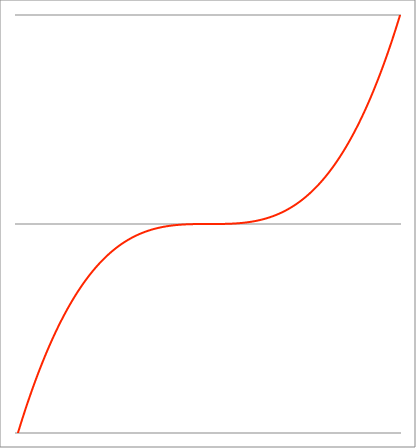
| Category | Series 1 |
|---|---|
| -1.01 | -1.03 |
| -1.00899 | -1.027 |
| -1.00798 | -1.024 |
| -1.00697 | -1.021 |
| -1.00596 | -1.018 |
| -1.00495 | -1.015 |
| -1.00394 | -1.012 |
| -1.00293 | -1.009 |
| -1.00192 | -1.006 |
| -1.00091 | -1.003 |
| -0.9999 | -1 |
| -0.99889 | -0.997 |
| -0.99788 | -0.994 |
| -0.996870000000001 | -0.991 |
| -0.995860000000001 | -0.988 |
| -0.994850000000001 | -0.985 |
| -0.993840000000001 | -0.982 |
| -0.992830000000001 | -0.979 |
| -0.991820000000001 | -0.976 |
| -0.990810000000001 | -0.973 |
| -0.989800000000001 | -0.97 |
| -0.988790000000001 | -0.967 |
| -0.987780000000001 | -0.964 |
| -0.986770000000001 | -0.961 |
| -0.985760000000001 | -0.958 |
| -0.984750000000001 | -0.955 |
| -0.983740000000001 | -0.952 |
| -0.982730000000001 | -0.949 |
| -0.981720000000001 | -0.946 |
| -0.980710000000001 | -0.943 |
| -0.979700000000001 | -0.94 |
| -0.978690000000001 | -0.937 |
| -0.977680000000001 | -0.935 |
| -0.976670000000001 | -0.932 |
| -0.975660000000001 | -0.929 |
| -0.974650000000002 | -0.926 |
| -0.973640000000002 | -0.923 |
| -0.972630000000002 | -0.92 |
| -0.971620000000002 | -0.917 |
| -0.970610000000002 | -0.914 |
| -0.969600000000002 | -0.912 |
| -0.968590000000002 | -0.909 |
| -0.967580000000002 | -0.906 |
| -0.966570000000002 | -0.903 |
| -0.965560000000002 | -0.9 |
| -0.964550000000002 | -0.897 |
| -0.963540000000002 | -0.895 |
| -0.962530000000002 | -0.892 |
| -0.961520000000002 | -0.889 |
| -0.960510000000002 | -0.886 |
| -0.959500000000002 | -0.883 |
| -0.958490000000002 | -0.881 |
| -0.957480000000002 | -0.878 |
| -0.956470000000002 | -0.875 |
| -0.955460000000002 | -0.872 |
| -0.954450000000002 | -0.869 |
| -0.953440000000002 | -0.867 |
| -0.952430000000003 | -0.864 |
| -0.951420000000003 | -0.861 |
| -0.950410000000003 | -0.858 |
| -0.949400000000003 | -0.856 |
| -0.948390000000003 | -0.853 |
| -0.947380000000003 | -0.85 |
| -0.946370000000003 | -0.848 |
| -0.945360000000003 | -0.845 |
| -0.944350000000003 | -0.842 |
| -0.943340000000003 | -0.839 |
| -0.942330000000003 | -0.837 |
| -0.941320000000003 | -0.834 |
| -0.940310000000003 | -0.831 |
| -0.939300000000003 | -0.829 |
| -0.938290000000003 | -0.826 |
| -0.937280000000003 | -0.823 |
| -0.936270000000003 | -0.821 |
| -0.935260000000003 | -0.818 |
| -0.934250000000003 | -0.815 |
| -0.933240000000003 | -0.813 |
| -0.932230000000003 | -0.81 |
| -0.931220000000003 | -0.808 |
| -0.930210000000004 | -0.805 |
| -0.929200000000004 | -0.802 |
| -0.928190000000004 | -0.8 |
| -0.927180000000004 | -0.797 |
| -0.926170000000004 | -0.794 |
| -0.925160000000004 | -0.792 |
| -0.924150000000004 | -0.789 |
| -0.923140000000004 | -0.787 |
| -0.922130000000004 | -0.784 |
| -0.921120000000004 | -0.782 |
| -0.920110000000004 | -0.779 |
| -0.919100000000004 | -0.776 |
| -0.918090000000004 | -0.774 |
| -0.917080000000004 | -0.771 |
| -0.916070000000004 | -0.769 |
| -0.915060000000004 | -0.766 |
| -0.914050000000004 | -0.764 |
| -0.913040000000004 | -0.761 |
| -0.912030000000004 | -0.759 |
| -0.911020000000004 | -0.756 |
| -0.910010000000004 | -0.754 |
| -0.909000000000004 | -0.751 |
| -0.907990000000004 | -0.749 |
| -0.906980000000005 | -0.746 |
| -0.905970000000005 | -0.744 |
| -0.904960000000005 | -0.741 |
| -0.903950000000005 | -0.739 |
| -0.902940000000005 | -0.736 |
| -0.901930000000005 | -0.734 |
| -0.900920000000005 | -0.731 |
| -0.899910000000005 | -0.729 |
| -0.898900000000005 | -0.726 |
| -0.897890000000005 | -0.724 |
| -0.896880000000005 | -0.721 |
| -0.895870000000005 | -0.719 |
| -0.894860000000005 | -0.717 |
| -0.893850000000005 | -0.714 |
| -0.892840000000005 | -0.712 |
| -0.891830000000005 | -0.709 |
| -0.890820000000005 | -0.707 |
| -0.889810000000005 | -0.705 |
| -0.888800000000005 | -0.702 |
| -0.887790000000005 | -0.7 |
| -0.886780000000005 | -0.697 |
| -0.885770000000005 | -0.695 |
| -0.884760000000005 | -0.693 |
| -0.883750000000006 | -0.69 |
| -0.882740000000006 | -0.688 |
| -0.881730000000006 | -0.685 |
| -0.880720000000006 | -0.683 |
| -0.879710000000006 | -0.681 |
| -0.878700000000006 | -0.678 |
| -0.877690000000006 | -0.676 |
| -0.876680000000006 | -0.674 |
| -0.875670000000006 | -0.671 |
| -0.874660000000006 | -0.669 |
| -0.873650000000006 | -0.667 |
| -0.872640000000006 | -0.665 |
| -0.871630000000006 | -0.662 |
| -0.870620000000006 | -0.66 |
| -0.869610000000006 | -0.658 |
| -0.868600000000006 | -0.655 |
| -0.867590000000006 | -0.653 |
| -0.866580000000006 | -0.651 |
| -0.865570000000006 | -0.648 |
| -0.864560000000006 | -0.646 |
| -0.863550000000006 | -0.644 |
| -0.862540000000006 | -0.642 |
| -0.861530000000007 | -0.639 |
| -0.860520000000007 | -0.637 |
| -0.859510000000007 | -0.635 |
| -0.858500000000007 | -0.633 |
| -0.857490000000007 | -0.631 |
| -0.856480000000007 | -0.628 |
| -0.855470000000007 | -0.626 |
| -0.854460000000007 | -0.624 |
| -0.853450000000007 | -0.622 |
| -0.852440000000007 | -0.619 |
| -0.851430000000007 | -0.617 |
| -0.850420000000007 | -0.615 |
| -0.849410000000007 | -0.613 |
| -0.848400000000007 | -0.611 |
| -0.847390000000007 | -0.608 |
| -0.846380000000007 | -0.606 |
| -0.845370000000007 | -0.604 |
| -0.844360000000007 | -0.602 |
| -0.843350000000007 | -0.6 |
| -0.842340000000007 | -0.598 |
| -0.841330000000007 | -0.596 |
| -0.840320000000007 | -0.593 |
| -0.839310000000007 | -0.591 |
| -0.838300000000008 | -0.589 |
| -0.837290000000008 | -0.587 |
| -0.836280000000008 | -0.585 |
| -0.835270000000008 | -0.583 |
| -0.834260000000008 | -0.581 |
| -0.833250000000008 | -0.579 |
| -0.832240000000008 | -0.576 |
| -0.831230000000008 | -0.574 |
| -0.830220000000008 | -0.572 |
| -0.829210000000008 | -0.57 |
| -0.828200000000008 | -0.568 |
| -0.827190000000008 | -0.566 |
| -0.826180000000008 | -0.564 |
| -0.825170000000008 | -0.562 |
| -0.824160000000008 | -0.56 |
| -0.823150000000008 | -0.558 |
| -0.822140000000008 | -0.556 |
| -0.821130000000008 | -0.554 |
| -0.820120000000008 | -0.552 |
| -0.819110000000008 | -0.55 |
| -0.818100000000008 | -0.548 |
| -0.817090000000008 | -0.546 |
| -0.816080000000009 | -0.543 |
| -0.815070000000009 | -0.541 |
| -0.814060000000009 | -0.539 |
| -0.813050000000009 | -0.537 |
| -0.812040000000009 | -0.535 |
| -0.811030000000009 | -0.533 |
| -0.810020000000009 | -0.531 |
| -0.809010000000009 | -0.529 |
| -0.808000000000009 | -0.528 |
| -0.806990000000009 | -0.526 |
| -0.805980000000009 | -0.524 |
| -0.804970000000009 | -0.522 |
| -0.803960000000009 | -0.52 |
| -0.802950000000009 | -0.518 |
| -0.801940000000009 | -0.516 |
| -0.800930000000009 | -0.514 |
| -0.799920000000009 | -0.512 |
| -0.798910000000009 | -0.51 |
| -0.797900000000009 | -0.508 |
| -0.796890000000009 | -0.506 |
| -0.795880000000009 | -0.504 |
| -0.794870000000009 | -0.502 |
| -0.793860000000009 | -0.5 |
| -0.79285000000001 | -0.498 |
| -0.79184000000001 | -0.496 |
| -0.79083000000001 | -0.495 |
| -0.78982000000001 | -0.493 |
| -0.78881000000001 | -0.491 |
| -0.78780000000001 | -0.489 |
| -0.78679000000001 | -0.487 |
| -0.78578000000001 | -0.485 |
| -0.78477000000001 | -0.483 |
| -0.78376000000001 | -0.481 |
| -0.78275000000001 | -0.48 |
| -0.78174000000001 | -0.478 |
| -0.78073000000001 | -0.476 |
| -0.77972000000001 | -0.474 |
| -0.77871000000001 | -0.472 |
| -0.77770000000001 | -0.47 |
| -0.77669000000001 | -0.469 |
| -0.77568000000001 | -0.467 |
| -0.77467000000001 | -0.465 |
| -0.77366000000001 | -0.463 |
| -0.77265000000001 | -0.461 |
| -0.77164000000001 | -0.459 |
| -0.770630000000011 | -0.458 |
| -0.769620000000011 | -0.456 |
| -0.768610000000011 | -0.454 |
| -0.767600000000011 | -0.452 |
| -0.766590000000011 | -0.45 |
| -0.765580000000011 | -0.449 |
| -0.764570000000011 | -0.447 |
| -0.763560000000011 | -0.445 |
| -0.762550000000011 | -0.443 |
| -0.761540000000011 | -0.442 |
| -0.760530000000011 | -0.44 |
| -0.759520000000011 | -0.438 |
| -0.758510000000011 | -0.436 |
| -0.757500000000011 | -0.435 |
| -0.756490000000011 | -0.433 |
| -0.755480000000011 | -0.431 |
| -0.754470000000011 | -0.429 |
| -0.753460000000011 | -0.428 |
| -0.752450000000011 | -0.426 |
| -0.751440000000011 | -0.424 |
| -0.750430000000011 | -0.423 |
| -0.749420000000011 | -0.421 |
| -0.748410000000011 | -0.419 |
| -0.747400000000012 | -0.418 |
| -0.746390000000012 | -0.416 |
| -0.745380000000012 | -0.414 |
| -0.744370000000012 | -0.412 |
| -0.743360000000012 | -0.411 |
| -0.742350000000012 | -0.409 |
| -0.741340000000012 | -0.407 |
| -0.740330000000012 | -0.406 |
| -0.739320000000012 | -0.404 |
| -0.738310000000012 | -0.402 |
| -0.737300000000012 | -0.401 |
| -0.736290000000012 | -0.399 |
| -0.735280000000012 | -0.398 |
| -0.734270000000012 | -0.396 |
| -0.733260000000012 | -0.394 |
| -0.732250000000012 | -0.393 |
| -0.731240000000012 | -0.391 |
| -0.730230000000012 | -0.389 |
| -0.729220000000012 | -0.388 |
| -0.728210000000012 | -0.386 |
| -0.727200000000012 | -0.385 |
| -0.726190000000012 | -0.383 |
| -0.725180000000013 | -0.381 |
| -0.724170000000013 | -0.38 |
| -0.723160000000013 | -0.378 |
| -0.722150000000013 | -0.377 |
| -0.721140000000013 | -0.375 |
| -0.720130000000013 | -0.373 |
| -0.719120000000013 | -0.372 |
| -0.718110000000013 | -0.37 |
| -0.717100000000013 | -0.369 |
| -0.716090000000013 | -0.367 |
| -0.715080000000013 | -0.366 |
| -0.714070000000013 | -0.364 |
| -0.713060000000013 | -0.363 |
| -0.712050000000013 | -0.361 |
| -0.711040000000013 | -0.359 |
| -0.710030000000013 | -0.358 |
| -0.709020000000013 | -0.356 |
| -0.708010000000013 | -0.355 |
| -0.707000000000013 | -0.353 |
| -0.705990000000013 | -0.352 |
| -0.704980000000013 | -0.35 |
| -0.703970000000013 | -0.349 |
| -0.702960000000014 | -0.347 |
| -0.701950000000014 | -0.346 |
| -0.700940000000014 | -0.344 |
| -0.699930000000014 | -0.343 |
| -0.698920000000014 | -0.341 |
| -0.697910000000014 | -0.34 |
| -0.696900000000014 | -0.338 |
| -0.695890000000014 | -0.337 |
| -0.694880000000014 | -0.336 |
| -0.693870000000014 | -0.334 |
| -0.692860000000014 | -0.333 |
| -0.691850000000014 | -0.331 |
| -0.690840000000014 | -0.33 |
| -0.689830000000014 | -0.328 |
| -0.688820000000014 | -0.327 |
| -0.687810000000014 | -0.325 |
| -0.686800000000014 | -0.324 |
| -0.685790000000014 | -0.323 |
| -0.684780000000014 | -0.321 |
| -0.683770000000014 | -0.32 |
| -0.682760000000014 | -0.318 |
| -0.681750000000014 | -0.317 |
| -0.680740000000014 | -0.315 |
| -0.679730000000015 | -0.314 |
| -0.678720000000015 | -0.313 |
| -0.677710000000015 | -0.311 |
| -0.676700000000015 | -0.31 |
| -0.675690000000015 | -0.308 |
| -0.674680000000015 | -0.307 |
| -0.673670000000015 | -0.306 |
| -0.672660000000015 | -0.304 |
| -0.671650000000015 | -0.303 |
| -0.670640000000015 | -0.302 |
| -0.669630000000015 | -0.3 |
| -0.668620000000015 | -0.299 |
| -0.667610000000015 | -0.298 |
| -0.666600000000015 | -0.296 |
| -0.665590000000015 | -0.295 |
| -0.664580000000015 | -0.294 |
| -0.663570000000015 | -0.292 |
| -0.662560000000015 | -0.291 |
| -0.661550000000015 | -0.29 |
| -0.660540000000015 | -0.288 |
| -0.659530000000015 | -0.287 |
| -0.658520000000015 | -0.286 |
| -0.657510000000015 | -0.284 |
| -0.656500000000016 | -0.283 |
| -0.655490000000016 | -0.282 |
| -0.654480000000016 | -0.28 |
| -0.653470000000016 | -0.279 |
| -0.652460000000016 | -0.278 |
| -0.651450000000016 | -0.276 |
| -0.650440000000016 | -0.275 |
| -0.649430000000016 | -0.274 |
| -0.648420000000016 | -0.273 |
| -0.647410000000016 | -0.271 |
| -0.646400000000016 | -0.27 |
| -0.645390000000016 | -0.269 |
| -0.644380000000016 | -0.268 |
| -0.643370000000016 | -0.266 |
| -0.642360000000016 | -0.265 |
| -0.641350000000016 | -0.264 |
| -0.640340000000016 | -0.263 |
| -0.639330000000016 | -0.261 |
| -0.638320000000016 | -0.26 |
| -0.637310000000016 | -0.259 |
| -0.636300000000016 | -0.258 |
| -0.635290000000016 | -0.256 |
| -0.634280000000017 | -0.255 |
| -0.633270000000017 | -0.254 |
| -0.632260000000017 | -0.253 |
| -0.631250000000017 | -0.252 |
| -0.630240000000017 | -0.25 |
| -0.629230000000017 | -0.249 |
| -0.628220000000017 | -0.248 |
| -0.627210000000017 | -0.247 |
| -0.626200000000017 | -0.246 |
| -0.625190000000017 | -0.244 |
| -0.624180000000017 | -0.243 |
| -0.623170000000017 | -0.242 |
| -0.622160000000017 | -0.241 |
| -0.621150000000017 | -0.24 |
| -0.620140000000017 | -0.238 |
| -0.619130000000017 | -0.237 |
| -0.618120000000017 | -0.236 |
| -0.617110000000017 | -0.235 |
| -0.616100000000017 | -0.234 |
| -0.615090000000017 | -0.233 |
| -0.614080000000017 | -0.232 |
| -0.613070000000017 | -0.23 |
| -0.612060000000017 | -0.229 |
| -0.611050000000018 | -0.228 |
| -0.610040000000018 | -0.227 |
| -0.609030000000018 | -0.226 |
| -0.608020000000018 | -0.225 |
| -0.607010000000018 | -0.224 |
| -0.606000000000018 | -0.223 |
| -0.604990000000018 | -0.221 |
| -0.603980000000018 | -0.22 |
| -0.602970000000018 | -0.219 |
| -0.601960000000018 | -0.218 |
| -0.600950000000018 | -0.217 |
| -0.599940000000018 | -0.216 |
| -0.598930000000018 | -0.215 |
| -0.597920000000018 | -0.214 |
| -0.596910000000018 | -0.213 |
| -0.595900000000018 | -0.212 |
| -0.594890000000018 | -0.211 |
| -0.593880000000018 | -0.209 |
| -0.592870000000018 | -0.208 |
| -0.591860000000018 | -0.207 |
| -0.590850000000019 | -0.206 |
| -0.589840000000019 | -0.205 |
| -0.588830000000019 | -0.204 |
| -0.587820000000019 | -0.203 |
| -0.586810000000019 | -0.202 |
| -0.585800000000019 | -0.201 |
| -0.584790000000019 | -0.2 |
| -0.583780000000019 | -0.199 |
| -0.582770000000019 | -0.198 |
| -0.581760000000019 | -0.197 |
| -0.580750000000019 | -0.196 |
| -0.579740000000019 | -0.195 |
| -0.578730000000019 | -0.194 |
| -0.577720000000019 | -0.193 |
| -0.576710000000019 | -0.192 |
| -0.575700000000019 | -0.191 |
| -0.574690000000019 | -0.19 |
| -0.573680000000019 | -0.189 |
| -0.572670000000019 | -0.188 |
| -0.571660000000019 | -0.187 |
| -0.570650000000019 | -0.186 |
| -0.569640000000019 | -0.185 |
| -0.568630000000019 | -0.184 |
| -0.56762000000002 | -0.183 |
| -0.56661000000002 | -0.182 |
| -0.56560000000002 | -0.181 |
| -0.56459000000002 | -0.18 |
| -0.56358000000002 | -0.179 |
| -0.56257000000002 | -0.178 |
| -0.56156000000002 | -0.177 |
| -0.56055000000002 | -0.176 |
| -0.55954000000002 | -0.175 |
| -0.55853000000002 | -0.174 |
| -0.55752000000002 | -0.173 |
| -0.55651000000002 | -0.172 |
| -0.55550000000002 | -0.171 |
| -0.55449000000002 | -0.17 |
| -0.55348000000002 | -0.17 |
| -0.55247000000002 | -0.169 |
| -0.55146000000002 | -0.168 |
| -0.55045000000002 | -0.167 |
| -0.54944000000002 | -0.166 |
| -0.54843000000002 | -0.165 |
| -0.54742000000002 | -0.164 |
| -0.54641000000002 | -0.163 |
| -0.545400000000021 | -0.162 |
| -0.544390000000021 | -0.161 |
| -0.543380000000021 | -0.16 |
| -0.542370000000021 | -0.16 |
| -0.541360000000021 | -0.159 |
| -0.540350000000021 | -0.158 |
| -0.539340000000021 | -0.157 |
| -0.538330000000021 | -0.156 |
| -0.537320000000021 | -0.155 |
| -0.536310000000021 | -0.154 |
| -0.535300000000021 | -0.153 |
| -0.534290000000021 | -0.153 |
| -0.533280000000021 | -0.152 |
| -0.532270000000021 | -0.151 |
| -0.531260000000021 | -0.15 |
| -0.530250000000021 | -0.149 |
| -0.529240000000021 | -0.148 |
| -0.528230000000021 | -0.147 |
| -0.527220000000021 | -0.147 |
| -0.526210000000021 | -0.146 |
| -0.525200000000021 | -0.145 |
| -0.524190000000021 | -0.144 |
| -0.523180000000022 | -0.143 |
| -0.522170000000022 | -0.142 |
| -0.521160000000022 | -0.142 |
| -0.520150000000022 | -0.141 |
| -0.519140000000022 | -0.14 |
| -0.518130000000022 | -0.139 |
| -0.517120000000022 | -0.138 |
| -0.516110000000022 | -0.137 |
| -0.515100000000022 | -0.137 |
| -0.514090000000022 | -0.136 |
| -0.513080000000022 | -0.135 |
| -0.512070000000022 | -0.134 |
| -0.511060000000022 | -0.133 |
| -0.510050000000022 | -0.133 |
| -0.509040000000022 | -0.132 |
| -0.508030000000022 | -0.131 |
| -0.507020000000022 | -0.13 |
| -0.506010000000022 | -0.13 |
| -0.505000000000022 | -0.129 |
| -0.503990000000022 | -0.128 |
| -0.502980000000022 | -0.127 |
| -0.501970000000022 | -0.126 |
| -0.500960000000022 | -0.126 |
| -0.499950000000022 | -0.125 |
| -0.498940000000022 | -0.124 |
| -0.497930000000022 | -0.123 |
| -0.496920000000022 | -0.123 |
| -0.495910000000022 | -0.122 |
| -0.494900000000022 | -0.121 |
| -0.493890000000022 | -0.12 |
| -0.492880000000022 | -0.12 |
| -0.491870000000022 | -0.119 |
| -0.490860000000022 | -0.118 |
| -0.489850000000022 | -0.118 |
| -0.488840000000022 | -0.117 |
| -0.487830000000022 | -0.116 |
| -0.486820000000022 | -0.115 |
| -0.485810000000022 | -0.115 |
| -0.484800000000022 | -0.114 |
| -0.483790000000022 | -0.113 |
| -0.482780000000022 | -0.113 |
| -0.481770000000022 | -0.112 |
| -0.480760000000022 | -0.111 |
| -0.479750000000022 | -0.11 |
| -0.478740000000022 | -0.11 |
| -0.477730000000022 | -0.109 |
| -0.476720000000022 | -0.108 |
| -0.475710000000022 | -0.108 |
| -0.474700000000022 | -0.107 |
| -0.473690000000022 | -0.106 |
| -0.472680000000022 | -0.106 |
| -0.471670000000022 | -0.105 |
| -0.470660000000022 | -0.104 |
| -0.469650000000022 | -0.104 |
| -0.468640000000022 | -0.103 |
| -0.467630000000022 | -0.102 |
| -0.466620000000022 | -0.102 |
| -0.465610000000022 | -0.101 |
| -0.464600000000022 | -0.1 |
| -0.463590000000022 | -0.1 |
| -0.462580000000022 | -0.099 |
| -0.461570000000022 | -0.098 |
| -0.460560000000022 | -0.098 |
| -0.459550000000022 | -0.097 |
| -0.458540000000022 | -0.096 |
| -0.457530000000022 | -0.096 |
| -0.456520000000022 | -0.095 |
| -0.455510000000022 | -0.095 |
| -0.454500000000022 | -0.094 |
| -0.453490000000022 | -0.093 |
| -0.452480000000022 | -0.093 |
| -0.451470000000022 | -0.092 |
| -0.450460000000022 | -0.091 |
| -0.449450000000022 | -0.091 |
| -0.448440000000022 | -0.09 |
| -0.447430000000022 | -0.09 |
| -0.446420000000022 | -0.089 |
| -0.445410000000022 | -0.088 |
| -0.444400000000022 | -0.088 |
| -0.443390000000022 | -0.087 |
| -0.442380000000022 | -0.087 |
| -0.441370000000022 | -0.086 |
| -0.440360000000022 | -0.085 |
| -0.439350000000022 | -0.085 |
| -0.438340000000022 | -0.084 |
| -0.437330000000022 | -0.084 |
| -0.436320000000022 | -0.083 |
| -0.435310000000022 | -0.082 |
| -0.434300000000022 | -0.082 |
| -0.433290000000022 | -0.081 |
| -0.432280000000022 | -0.081 |
| -0.431270000000022 | -0.08 |
| -0.430260000000022 | -0.08 |
| -0.429250000000022 | -0.079 |
| -0.428240000000022 | -0.079 |
| -0.427230000000022 | -0.078 |
| -0.426220000000022 | -0.077 |
| -0.425210000000022 | -0.077 |
| -0.424200000000022 | -0.076 |
| -0.423190000000022 | -0.076 |
| -0.422180000000022 | -0.075 |
| -0.421170000000022 | -0.075 |
| -0.420160000000022 | -0.074 |
| -0.419150000000022 | -0.074 |
| -0.418140000000022 | -0.073 |
| -0.417130000000022 | -0.073 |
| -0.416120000000022 | -0.072 |
| -0.415110000000022 | -0.072 |
| -0.414100000000022 | -0.071 |
| -0.413090000000022 | -0.07 |
| -0.412080000000022 | -0.07 |
| -0.411070000000022 | -0.069 |
| -0.410060000000021 | -0.069 |
| -0.409050000000021 | -0.068 |
| -0.408040000000021 | -0.068 |
| -0.407030000000021 | -0.067 |
| -0.406020000000021 | -0.067 |
| -0.405010000000021 | -0.066 |
| -0.404000000000021 | -0.066 |
| -0.402990000000021 | -0.065 |
| -0.401980000000021 | -0.065 |
| -0.400970000000021 | -0.064 |
| -0.399960000000021 | -0.064 |
| -0.398950000000021 | -0.063 |
| -0.397940000000021 | -0.063 |
| -0.396930000000021 | -0.063 |
| -0.395920000000021 | -0.062 |
| -0.394910000000021 | -0.062 |
| -0.393900000000021 | -0.061 |
| -0.392890000000021 | -0.061 |
| -0.391880000000021 | -0.06 |
| -0.390870000000021 | -0.06 |
| -0.389860000000021 | -0.059 |
| -0.388850000000021 | -0.059 |
| -0.387840000000021 | -0.058 |
| -0.386830000000021 | -0.058 |
| -0.385820000000021 | -0.057 |
| -0.384810000000021 | -0.057 |
| -0.383800000000021 | -0.057 |
| -0.382790000000021 | -0.056 |
| -0.381780000000021 | -0.056 |
| -0.380770000000021 | -0.055 |
| -0.379760000000021 | -0.055 |
| -0.378750000000021 | -0.054 |
| -0.377740000000021 | -0.054 |
| -0.376730000000021 | -0.053 |
| -0.375720000000021 | -0.053 |
| -0.374710000000021 | -0.053 |
| -0.373700000000021 | -0.052 |
| -0.372690000000021 | -0.052 |
| -0.371680000000021 | -0.051 |
| -0.370670000000021 | -0.051 |
| -0.369660000000021 | -0.051 |
| -0.368650000000021 | -0.05 |
| -0.367640000000021 | -0.05 |
| -0.366630000000021 | -0.049 |
| -0.365620000000021 | -0.049 |
| -0.364610000000021 | -0.048 |
| -0.363600000000021 | -0.048 |
| -0.362590000000021 | -0.048 |
| -0.361580000000021 | -0.047 |
| -0.360570000000021 | -0.047 |
| -0.359560000000021 | -0.046 |
| -0.358550000000021 | -0.046 |
| -0.357540000000021 | -0.046 |
| -0.356530000000021 | -0.045 |
| -0.355520000000021 | -0.045 |
| -0.354510000000021 | -0.045 |
| -0.353500000000021 | -0.044 |
| -0.352490000000021 | -0.044 |
| -0.351480000000021 | -0.043 |
| -0.350470000000021 | -0.043 |
| -0.349460000000021 | -0.043 |
| -0.348450000000021 | -0.042 |
| -0.347440000000021 | -0.042 |
| -0.346430000000021 | -0.042 |
| -0.345420000000021 | -0.041 |
| -0.344410000000021 | -0.041 |
| -0.343400000000021 | -0.04 |
| -0.342390000000021 | -0.04 |
| -0.341380000000021 | -0.04 |
| -0.340370000000021 | -0.039 |
| -0.339360000000021 | -0.039 |
| -0.338350000000021 | -0.039 |
| -0.337340000000021 | -0.038 |
| -0.336330000000021 | -0.038 |
| -0.335320000000021 | -0.038 |
| -0.334310000000021 | -0.037 |
| -0.333300000000021 | -0.037 |
| -0.332290000000021 | -0.037 |
| -0.331280000000021 | -0.036 |
| -0.330270000000021 | -0.036 |
| -0.329260000000021 | -0.036 |
| -0.328250000000021 | -0.035 |
| -0.327240000000021 | -0.035 |
| -0.326230000000021 | -0.035 |
| -0.325220000000021 | -0.034 |
| -0.324210000000021 | -0.034 |
| -0.323200000000021 | -0.034 |
| -0.322190000000021 | -0.033 |
| -0.321180000000021 | -0.033 |
| -0.320170000000021 | -0.033 |
| -0.31916000000002 | -0.033 |
| -0.31815000000002 | -0.032 |
| -0.31714000000002 | -0.032 |
| -0.31613000000002 | -0.032 |
| -0.31512000000002 | -0.031 |
| -0.31411000000002 | -0.031 |
| -0.31310000000002 | -0.031 |
| -0.31209000000002 | -0.03 |
| -0.31108000000002 | -0.03 |
| -0.31007000000002 | -0.03 |
| -0.30906000000002 | -0.03 |
| -0.30805000000002 | -0.029 |
| -0.30704000000002 | -0.029 |
| -0.30603000000002 | -0.029 |
| -0.30502000000002 | -0.028 |
| -0.30401000000002 | -0.028 |
| -0.30300000000002 | -0.028 |
| -0.30199000000002 | -0.028 |
| -0.30098000000002 | -0.027 |
| -0.29997000000002 | -0.027 |
| -0.29896000000002 | -0.027 |
| -0.29795000000002 | -0.026 |
| -0.29694000000002 | -0.026 |
| -0.29593000000002 | -0.026 |
| -0.29492000000002 | -0.026 |
| -0.29391000000002 | -0.025 |
| -0.29290000000002 | -0.025 |
| -0.29189000000002 | -0.025 |
| -0.29088000000002 | -0.025 |
| -0.28987000000002 | -0.024 |
| -0.28886000000002 | -0.024 |
| -0.28785000000002 | -0.024 |
| -0.28684000000002 | -0.024 |
| -0.28583000000002 | -0.023 |
| -0.28482000000002 | -0.023 |
| -0.28381000000002 | -0.023 |
| -0.28280000000002 | -0.023 |
| -0.28179000000002 | -0.022 |
| -0.28078000000002 | -0.022 |
| -0.27977000000002 | -0.022 |
| -0.27876000000002 | -0.022 |
| -0.27775000000002 | -0.021 |
| -0.27674000000002 | -0.021 |
| -0.27573000000002 | -0.021 |
| -0.27472000000002 | -0.021 |
| -0.27371000000002 | -0.021 |
| -0.27270000000002 | -0.02 |
| -0.27169000000002 | -0.02 |
| -0.27068000000002 | -0.02 |
| -0.26967000000002 | -0.02 |
| -0.26866000000002 | -0.019 |
| -0.26765000000002 | -0.019 |
| -0.26664000000002 | -0.019 |
| -0.26563000000002 | -0.019 |
| -0.26462000000002 | -0.019 |
| -0.26361000000002 | -0.018 |
| -0.26260000000002 | -0.018 |
| -0.26159000000002 | -0.018 |
| -0.26058000000002 | -0.018 |
| -0.25957000000002 | -0.017 |
| -0.25856000000002 | -0.017 |
| -0.25755000000002 | -0.017 |
| -0.25654000000002 | -0.017 |
| -0.25553000000002 | -0.017 |
| -0.25452000000002 | -0.016 |
| -0.25351000000002 | -0.016 |
| -0.25250000000002 | -0.016 |
| -0.25149000000002 | -0.016 |
| -0.25048000000002 | -0.016 |
| -0.24947000000002 | -0.016 |
| -0.24846000000002 | -0.015 |
| -0.24745000000002 | -0.015 |
| -0.24644000000002 | -0.015 |
| -0.24543000000002 | -0.015 |
| -0.24442000000002 | -0.015 |
| -0.24341000000002 | -0.014 |
| -0.24240000000002 | -0.014 |
| -0.24139000000002 | -0.014 |
| -0.24038000000002 | -0.014 |
| -0.23937000000002 | -0.014 |
| -0.23836000000002 | -0.014 |
| -0.23735000000002 | -0.013 |
| -0.23634000000002 | -0.013 |
| -0.23533000000002 | -0.013 |
| -0.23432000000002 | -0.013 |
| -0.23331000000002 | -0.013 |
| -0.23230000000002 | -0.013 |
| -0.23129000000002 | -0.012 |
| -0.23028000000002 | -0.012 |
| -0.22927000000002 | -0.012 |
| -0.22826000000002 | -0.012 |
| -0.22725000000002 | -0.012 |
| -0.22624000000002 | -0.012 |
| -0.22523000000002 | -0.011 |
| -0.224220000000019 | -0.011 |
| -0.223210000000019 | -0.011 |
| -0.222200000000019 | -0.011 |
| -0.221190000000019 | -0.011 |
| -0.220180000000019 | -0.011 |
| -0.219170000000019 | -0.011 |
| -0.218160000000019 | -0.01 |
| -0.217150000000019 | -0.01 |
| -0.216140000000019 | -0.01 |
| -0.215130000000019 | -0.01 |
| -0.214120000000019 | -0.01 |
| -0.213110000000019 | -0.01 |
| -0.212100000000019 | -0.01 |
| -0.211090000000019 | -0.009 |
| -0.210080000000019 | -0.009 |
| -0.209070000000019 | -0.009 |
| -0.208060000000019 | -0.009 |
| -0.207050000000019 | -0.009 |
| -0.206040000000019 | -0.009 |
| -0.205030000000019 | -0.009 |
| -0.204020000000019 | -0.008 |
| -0.203010000000019 | -0.008 |
| -0.202000000000019 | -0.008 |
| -0.200990000000019 | -0.008 |
| -0.199980000000019 | -0.008 |
| -0.198970000000019 | -0.008 |
| -0.197960000000019 | -0.008 |
| -0.196950000000019 | -0.008 |
| -0.195940000000019 | -0.008 |
| -0.194930000000019 | -0.007 |
| -0.193920000000019 | -0.007 |
| -0.192910000000019 | -0.007 |
| -0.191900000000019 | -0.007 |
| -0.190890000000019 | -0.007 |
| -0.189880000000019 | -0.007 |
| -0.188870000000019 | -0.007 |
| -0.187860000000019 | -0.007 |
| -0.186850000000019 | -0.007 |
| -0.185840000000019 | -0.006 |
| -0.184830000000019 | -0.006 |
| -0.183820000000019 | -0.006 |
| -0.182810000000019 | -0.006 |
| -0.181800000000019 | -0.006 |
| -0.180790000000019 | -0.006 |
| -0.179780000000019 | -0.006 |
| -0.178770000000019 | -0.006 |
| -0.177760000000019 | -0.006 |
| -0.176750000000019 | -0.006 |
| -0.175740000000019 | -0.005 |
| -0.174730000000019 | -0.005 |
| -0.173720000000019 | -0.005 |
| -0.172710000000019 | -0.005 |
| -0.171700000000019 | -0.005 |
| -0.170690000000019 | -0.005 |
| -0.169680000000019 | -0.005 |
| -0.168670000000019 | -0.005 |
| -0.167660000000019 | -0.005 |
| -0.166650000000019 | -0.005 |
| -0.165640000000019 | -0.005 |
| -0.164630000000019 | -0.004 |
| -0.163620000000019 | -0.004 |
| -0.162610000000019 | -0.004 |
| -0.161600000000019 | -0.004 |
| -0.160590000000019 | -0.004 |
| -0.159580000000019 | -0.004 |
| -0.158570000000019 | -0.004 |
| -0.157560000000019 | -0.004 |
| -0.156550000000019 | -0.004 |
| -0.155540000000019 | -0.004 |
| -0.154530000000019 | -0.004 |
| -0.153520000000019 | -0.004 |
| -0.152510000000019 | -0.004 |
| -0.151500000000019 | -0.003 |
| -0.150490000000019 | -0.003 |
| -0.149480000000019 | -0.003 |
| -0.148470000000019 | -0.003 |
| -0.147460000000019 | -0.003 |
| -0.146450000000019 | -0.003 |
| -0.145440000000019 | -0.003 |
| -0.144430000000019 | -0.003 |
| -0.143420000000019 | -0.003 |
| -0.142410000000019 | -0.003 |
| -0.141400000000019 | -0.003 |
| -0.140390000000019 | -0.003 |
| -0.139380000000019 | -0.003 |
| -0.138370000000019 | -0.003 |
| -0.137360000000019 | -0.003 |
| -0.136350000000019 | -0.003 |
| -0.135340000000019 | -0.002 |
| -0.134330000000019 | -0.002 |
| -0.133320000000019 | -0.002 |
| -0.132310000000019 | -0.002 |
| -0.131300000000019 | -0.002 |
| -0.130290000000018 | -0.002 |
| -0.129280000000018 | -0.002 |
| -0.128270000000018 | -0.002 |
| -0.127260000000018 | -0.002 |
| -0.126250000000018 | -0.002 |
| -0.125240000000018 | -0.002 |
| -0.124230000000018 | -0.002 |
| -0.123220000000018 | -0.002 |
| -0.122210000000018 | -0.002 |
| -0.121200000000018 | -0.002 |
| -0.120190000000018 | -0.002 |
| -0.119180000000018 | -0.002 |
| -0.118170000000018 | -0.002 |
| -0.117160000000018 | -0.002 |
| -0.116150000000018 | -0.002 |
| -0.115140000000018 | -0.002 |
| -0.114130000000018 | -0.001 |
| -0.113120000000018 | -0.001 |
| -0.112110000000018 | -0.001 |
| -0.111100000000018 | -0.001 |
| -0.110090000000018 | -0.001 |
| -0.109080000000018 | -0.001 |
| -0.108070000000018 | -0.001 |
| -0.107060000000018 | -0.001 |
| -0.106050000000018 | -0.001 |
| -0.105040000000019 | -0.001 |
| -0.104030000000019 | -0.001 |
| -0.103020000000019 | -0.001 |
| -0.102010000000019 | -0.001 |
| -0.101000000000019 | -0.001 |
| -0.0999900000000185 | -0.001 |
| -0.0989800000000185 | -0.001 |
| -0.0979700000000185 | -0.001 |
| -0.0969600000000185 | -0.001 |
| -0.0959500000000185 | -0.001 |
| -0.0949400000000185 | -0.001 |
| -0.0939300000000185 | -0.001 |
| -0.0929200000000185 | -0.001 |
| -0.0919100000000185 | -0.001 |
| -0.0909000000000185 | -0.001 |
| -0.0898900000000185 | -0.001 |
| -0.0888800000000185 | -0.001 |
| -0.0878700000000185 | -0.001 |
| -0.0868600000000185 | -0.001 |
| -0.0858500000000185 | -0.001 |
| -0.0848400000000186 | -0.001 |
| -0.0838300000000186 | -0.001 |
| -0.0828200000000186 | -0.001 |
| -0.0818100000000186 | -0.001 |
| -0.0808000000000186 | -0.001 |
| -0.0797900000000186 | -0.001 |
| -0.0787800000000186 | 0 |
| -0.0777700000000186 | 0 |
| -0.0767600000000186 | 0 |
| -0.0757500000000186 | 0 |
| -0.0747400000000186 | 0 |
| -0.0737300000000186 | 0 |
| -0.0727200000000186 | 0 |
| -0.0717100000000186 | 0 |
| -0.0707000000000186 | 0 |
| -0.0696900000000186 | 0 |
| -0.0686800000000186 | 0 |
| -0.0676700000000186 | 0 |
| -0.0666600000000186 | 0 |
| -0.0656500000000186 | 0 |
| -0.0646400000000186 | 0 |
| -0.0636300000000186 | 0 |
| -0.0626200000000186 | 0 |
| -0.0616100000000186 | 0 |
| -0.0606000000000186 | 0 |
| -0.0595900000000186 | 0 |
| -0.0585800000000186 | 0 |
| -0.0575700000000186 | 0 |
| -0.0565600000000186 | 0 |
| -0.0555500000000186 | 0 |
| -0.0545400000000186 | 0 |
| -0.0535300000000186 | 0 |
| -0.0525200000000187 | 0 |
| -0.0515100000000187 | 0 |
| -0.0505000000000187 | 0 |
| -0.0494900000000187 | 0 |
| -0.0484800000000187 | 0 |
| -0.0474700000000187 | 0 |
| -0.0464600000000187 | 0 |
| -0.0454500000000187 | 0 |
| -0.0444400000000187 | 0 |
| -0.0434300000000187 | 0 |
| -0.0424200000000187 | 0 |
| -0.0414100000000187 | 0 |
| -0.0404000000000187 | 0 |
| -0.0393900000000187 | 0 |
| -0.0383800000000187 | 0 |
| -0.0373700000000187 | 0 |
| -0.0363600000000187 | 0 |
| -0.0353500000000187 | 0 |
| -0.0343400000000187 | 0 |
| -0.0333300000000187 | 0 |
| -0.0323200000000187 | 0 |
| -0.0313100000000187 | 0 |
| -0.0303000000000187 | 0 |
| -0.0292900000000187 | 0 |
| -0.0282800000000187 | 0 |
| -0.0272700000000187 | 0 |
| -0.0262600000000187 | 0 |
| -0.0252500000000187 | 0 |
| -0.0242400000000187 | 0 |
| -0.0232300000000187 | 0 |
| -0.0222200000000187 | 0 |
| -0.0212100000000187 | 0 |
| -0.0202000000000187 | 0 |
| -0.0191900000000187 | 0 |
| -0.0181800000000187 | 0 |
| -0.0171700000000187 | 0 |
| -0.0161600000000187 | 0 |
| -0.0151500000000187 | 0 |
| -0.0141400000000187 | 0 |
| -0.0131300000000187 | 0 |
| -0.0121200000000187 | 0 |
| -0.0111100000000187 | 0 |
| -0.0101000000000187 | 0 |
| -0.00909000000001871 | 0 |
| -0.00808000000001871 | 0 |
| -0.00707000000001871 | 0 |
| -0.00606000000001871 | 0 |
| -0.00505000000001871 | 0 |
| -0.00404000000001871 | 0 |
| -0.00303000000001871 | 0 |
| -0.00202000000001871 | 0 |
| -0.00101000000001871 | 0 |
| -1.87124621353618e-14 | 0 |
| 0.00100999999998129 | 0 |
| 0.00201999999998129 | 0 |
| 0.00302999999998129 | 0 |
| 0.00403999999998129 | 0 |
| 0.00504999999998129 | 0 |
| 0.00605999999998129 | 0 |
| 0.00706999999998129 | 0 |
| 0.00807999999998129 | 0 |
| 0.00908999999998129 | 0 |
| 0.0100999999999813 | 0 |
| 0.0111099999999813 | 0 |
| 0.0121199999999813 | 0 |
| 0.0131299999999813 | 0 |
| 0.0141399999999813 | 0 |
| 0.0151499999999813 | 0 |
| 0.0161599999999813 | 0 |
| 0.0171699999999813 | 0 |
| 0.0181799999999813 | 0 |
| 0.0191899999999813 | 0 |
| 0.0201999999999813 | 0 |
| 0.0212099999999813 | 0 |
| 0.0222199999999813 | 0 |
| 0.0232299999999813 | 0 |
| 0.0242399999999813 | 0 |
| 0.0252499999999813 | 0 |
| 0.0262599999999813 | 0 |
| 0.0272699999999813 | 0 |
| 0.0282799999999813 | 0 |
| 0.0292899999999813 | 0 |
| 0.0302999999999813 | 0 |
| 0.0313099999999813 | 0 |
| 0.0323199999999813 | 0 |
| 0.0333299999999813 | 0 |
| 0.0343399999999813 | 0 |
| 0.0353499999999813 | 0 |
| 0.0363599999999813 | 0 |
| 0.0373699999999813 | 0 |
| 0.0383799999999813 | 0 |
| 0.0393899999999813 | 0 |
| 0.0403999999999813 | 0 |
| 0.0414099999999813 | 0 |
| 0.0424199999999813 | 0 |
| 0.0434299999999813 | 0 |
| 0.0444399999999812 | 0 |
| 0.0454499999999812 | 0 |
| 0.0464599999999812 | 0 |
| 0.0474699999999812 | 0 |
| 0.0484799999999812 | 0 |
| 0.0494899999999812 | 0 |
| 0.0504999999999812 | 0 |
| 0.0515099999999812 | 0 |
| 0.0525199999999812 | 0 |
| 0.0535299999999812 | 0 |
| 0.0545399999999812 | 0 |
| 0.0555499999999812 | 0 |
| 0.0565599999999812 | 0 |
| 0.0575699999999812 | 0 |
| 0.0585799999999812 | 0 |
| 0.0595899999999812 | 0 |
| 0.0605999999999812 | 0 |
| 0.0616099999999812 | 0 |
| 0.0626199999999812 | 0 |
| 0.0636299999999812 | 0 |
| 0.0646399999999812 | 0 |
| 0.0656499999999812 | 0 |
| 0.0666599999999812 | 0 |
| 0.0676699999999812 | 0 |
| 0.0686799999999812 | 0 |
| 0.0696899999999812 | 0 |
| 0.0706999999999812 | 0 |
| 0.0717099999999812 | 0 |
| 0.0727199999999812 | 0 |
| 0.0737299999999812 | 0 |
| 0.0747399999999812 | 0 |
| 0.0757499999999812 | 0 |
| 0.0767599999999812 | 0 |
| 0.0777699999999812 | 0 |
| 0.0787799999999811 | 0 |
| 0.0797899999999811 | 0.001 |
| 0.0807999999999811 | 0.001 |
| 0.0818099999999811 | 0.001 |
| 0.0828199999999811 | 0.001 |
| 0.0838299999999811 | 0.001 |
| 0.0848399999999811 | 0.001 |
| 0.0858499999999811 | 0.001 |
| 0.0868599999999811 | 0.001 |
| 0.0878699999999811 | 0.001 |
| 0.0888799999999811 | 0.001 |
| 0.0898899999999811 | 0.001 |
| 0.0908999999999811 | 0.001 |
| 0.0919099999999811 | 0.001 |
| 0.0929199999999811 | 0.001 |
| 0.0939299999999811 | 0.001 |
| 0.0949399999999811 | 0.001 |
| 0.0959499999999811 | 0.001 |
| 0.0969599999999811 | 0.001 |
| 0.0979699999999811 | 0.001 |
| 0.0989799999999811 | 0.001 |
| 0.0999899999999811 | 0.001 |
| 0.100999999999981 | 0.001 |
| 0.102009999999981 | 0.001 |
| 0.103019999999981 | 0.001 |
| 0.104029999999981 | 0.001 |
| 0.105039999999981 | 0.001 |
| 0.106049999999981 | 0.001 |
| 0.107059999999981 | 0.001 |
| 0.108069999999981 | 0.001 |
| 0.109079999999981 | 0.001 |
| 0.110089999999981 | 0.001 |
| 0.111099999999981 | 0.001 |
| 0.112109999999981 | 0.001 |
| 0.113119999999981 | 0.001 |
| 0.114129999999981 | 0.001 |
| 0.115139999999981 | 0.002 |
| 0.116149999999981 | 0.002 |
| 0.117159999999981 | 0.002 |
| 0.118169999999981 | 0.002 |
| 0.119179999999981 | 0.002 |
| 0.120189999999981 | 0.002 |
| 0.121199999999981 | 0.002 |
| 0.122209999999981 | 0.002 |
| 0.123219999999981 | 0.002 |
| 0.124229999999981 | 0.002 |
| 0.125239999999981 | 0.002 |
| 0.126249999999981 | 0.002 |
| 0.127259999999981 | 0.002 |
| 0.128269999999981 | 0.002 |
| 0.129279999999981 | 0.002 |
| 0.130289999999981 | 0.002 |
| 0.131299999999981 | 0.002 |
| 0.132309999999981 | 0.002 |
| 0.133319999999981 | 0.002 |
| 0.134329999999981 | 0.002 |
| 0.135339999999981 | 0.002 |
| 0.136349999999981 | 0.003 |
| 0.137359999999981 | 0.003 |
| 0.138369999999981 | 0.003 |
| 0.139379999999981 | 0.003 |
| 0.140389999999981 | 0.003 |
| 0.141399999999981 | 0.003 |
| 0.142409999999981 | 0.003 |
| 0.143419999999981 | 0.003 |
| 0.144429999999981 | 0.003 |
| 0.145439999999981 | 0.003 |
| 0.146449999999981 | 0.003 |
| 0.147459999999981 | 0.003 |
| 0.148469999999981 | 0.003 |
| 0.149479999999981 | 0.003 |
| 0.150489999999981 | 0.003 |
| 0.151499999999981 | 0.003 |
| 0.152509999999981 | 0.004 |
| 0.153519999999981 | 0.004 |
| 0.154529999999981 | 0.004 |
| 0.155539999999981 | 0.004 |
| 0.156549999999981 | 0.004 |
| 0.157559999999981 | 0.004 |
| 0.158569999999981 | 0.004 |
| 0.159579999999981 | 0.004 |
| 0.160589999999981 | 0.004 |
| 0.161599999999981 | 0.004 |
| 0.162609999999981 | 0.004 |
| 0.163619999999981 | 0.004 |
| 0.164629999999981 | 0.004 |
| 0.165639999999981 | 0.005 |
| 0.166649999999981 | 0.005 |
| 0.167659999999981 | 0.005 |
| 0.168669999999981 | 0.005 |
| 0.169679999999981 | 0.005 |
| 0.170689999999982 | 0.005 |
| 0.171699999999982 | 0.005 |
| 0.172709999999982 | 0.005 |
| 0.173719999999982 | 0.005 |
| 0.174729999999982 | 0.005 |
| 0.175739999999982 | 0.005 |
| 0.176749999999982 | 0.006 |
| 0.177759999999982 | 0.006 |
| 0.178769999999982 | 0.006 |
| 0.179779999999982 | 0.006 |
| 0.180789999999982 | 0.006 |
| 0.181799999999982 | 0.006 |
| 0.182809999999982 | 0.006 |
| 0.183819999999982 | 0.006 |
| 0.184829999999982 | 0.006 |
| 0.185839999999982 | 0.006 |
| 0.186849999999982 | 0.007 |
| 0.187859999999982 | 0.007 |
| 0.188869999999982 | 0.007 |
| 0.189879999999982 | 0.007 |
| 0.190889999999982 | 0.007 |
| 0.191899999999982 | 0.007 |
| 0.192909999999982 | 0.007 |
| 0.193919999999982 | 0.007 |
| 0.194929999999982 | 0.007 |
| 0.195939999999982 | 0.008 |
| 0.196949999999982 | 0.008 |
| 0.197959999999982 | 0.008 |
| 0.198969999999982 | 0.008 |
| 0.199979999999982 | 0.008 |
| 0.200989999999982 | 0.008 |
| 0.201999999999982 | 0.008 |
| 0.203009999999982 | 0.008 |
| 0.204019999999982 | 0.008 |
| 0.205029999999982 | 0.009 |
| 0.206039999999982 | 0.009 |
| 0.207049999999982 | 0.009 |
| 0.208059999999982 | 0.009 |
| 0.209069999999982 | 0.009 |
| 0.210079999999982 | 0.009 |
| 0.211089999999982 | 0.009 |
| 0.212099999999982 | 0.01 |
| 0.213109999999982 | 0.01 |
| 0.214119999999982 | 0.01 |
| 0.215129999999982 | 0.01 |
| 0.216139999999982 | 0.01 |
| 0.217149999999982 | 0.01 |
| 0.218159999999982 | 0.01 |
| 0.219169999999982 | 0.011 |
| 0.220179999999982 | 0.011 |
| 0.221189999999982 | 0.011 |
| 0.222199999999982 | 0.011 |
| 0.223209999999982 | 0.011 |
| 0.224219999999982 | 0.011 |
| 0.225229999999982 | 0.011 |
| 0.226239999999982 | 0.012 |
| 0.227249999999982 | 0.012 |
| 0.228259999999982 | 0.012 |
| 0.229269999999982 | 0.012 |
| 0.230279999999982 | 0.012 |
| 0.231289999999982 | 0.012 |
| 0.232299999999982 | 0.013 |
| 0.233309999999982 | 0.013 |
| 0.234319999999982 | 0.013 |
| 0.235329999999982 | 0.013 |
| 0.236339999999982 | 0.013 |
| 0.237349999999982 | 0.013 |
| 0.238359999999982 | 0.014 |
| 0.239369999999982 | 0.014 |
| 0.240379999999982 | 0.014 |
| 0.241389999999982 | 0.014 |
| 0.242399999999982 | 0.014 |
| 0.243409999999982 | 0.014 |
| 0.244419999999982 | 0.015 |
| 0.245429999999982 | 0.015 |
| 0.246439999999982 | 0.015 |
| 0.247449999999982 | 0.015 |
| 0.248459999999982 | 0.015 |
| 0.249469999999982 | 0.016 |
| 0.250479999999982 | 0.016 |
| 0.251489999999982 | 0.016 |
| 0.252499999999982 | 0.016 |
| 0.253509999999982 | 0.016 |
| 0.254519999999982 | 0.016 |
| 0.255529999999982 | 0.017 |
| 0.256539999999982 | 0.017 |
| 0.257549999999982 | 0.017 |
| 0.258559999999982 | 0.017 |
| 0.259569999999982 | 0.017 |
| 0.260579999999982 | 0.018 |
| 0.261589999999982 | 0.018 |
| 0.262599999999982 | 0.018 |
| 0.263609999999983 | 0.018 |
| 0.264619999999983 | 0.019 |
| 0.265629999999983 | 0.019 |
| 0.266639999999983 | 0.019 |
| 0.267649999999983 | 0.019 |
| 0.268659999999983 | 0.019 |
| 0.269669999999983 | 0.02 |
| 0.270679999999983 | 0.02 |
| 0.271689999999983 | 0.02 |
| 0.272699999999983 | 0.02 |
| 0.273709999999983 | 0.021 |
| 0.274719999999983 | 0.021 |
| 0.275729999999983 | 0.021 |
| 0.276739999999983 | 0.021 |
| 0.277749999999983 | 0.021 |
| 0.278759999999983 | 0.022 |
| 0.279769999999983 | 0.022 |
| 0.280779999999983 | 0.022 |
| 0.281789999999983 | 0.022 |
| 0.282799999999983 | 0.023 |
| 0.283809999999983 | 0.023 |
| 0.284819999999983 | 0.023 |
| 0.285829999999983 | 0.023 |
| 0.286839999999983 | 0.024 |
| 0.287849999999983 | 0.024 |
| 0.288859999999983 | 0.024 |
| 0.289869999999983 | 0.024 |
| 0.290879999999983 | 0.025 |
| 0.291889999999983 | 0.025 |
| 0.292899999999983 | 0.025 |
| 0.293909999999983 | 0.025 |
| 0.294919999999983 | 0.026 |
| 0.295929999999983 | 0.026 |
| 0.296939999999983 | 0.026 |
| 0.297949999999983 | 0.026 |
| 0.298959999999983 | 0.027 |
| 0.299969999999983 | 0.027 |
| 0.300979999999983 | 0.027 |
| 0.301989999999983 | 0.028 |
| 0.302999999999983 | 0.028 |
| 0.304009999999983 | 0.028 |
| 0.305019999999983 | 0.028 |
| 0.306029999999983 | 0.029 |
| 0.307039999999983 | 0.029 |
| 0.308049999999983 | 0.029 |
| 0.309059999999983 | 0.03 |
| 0.310069999999983 | 0.03 |
| 0.311079999999983 | 0.03 |
| 0.312089999999983 | 0.03 |
| 0.313099999999983 | 0.031 |
| 0.314109999999983 | 0.031 |
| 0.315119999999983 | 0.031 |
| 0.316129999999983 | 0.032 |
| 0.317139999999983 | 0.032 |
| 0.318149999999983 | 0.032 |
| 0.319159999999983 | 0.033 |
| 0.320169999999983 | 0.033 |
| 0.321179999999983 | 0.033 |
| 0.322189999999983 | 0.033 |
| 0.323199999999983 | 0.034 |
| 0.324209999999983 | 0.034 |
| 0.325219999999983 | 0.034 |
| 0.326229999999983 | 0.035 |
| 0.327239999999983 | 0.035 |
| 0.328249999999983 | 0.035 |
| 0.329259999999983 | 0.036 |
| 0.330269999999983 | 0.036 |
| 0.331279999999983 | 0.036 |
| 0.332289999999983 | 0.037 |
| 0.333299999999983 | 0.037 |
| 0.334309999999983 | 0.037 |
| 0.335319999999983 | 0.038 |
| 0.336329999999983 | 0.038 |
| 0.337339999999983 | 0.038 |
| 0.338349999999983 | 0.039 |
| 0.339359999999983 | 0.039 |
| 0.340369999999983 | 0.039 |
| 0.341379999999983 | 0.04 |
| 0.342389999999983 | 0.04 |
| 0.343399999999983 | 0.04 |
| 0.344409999999983 | 0.041 |
| 0.345419999999983 | 0.041 |
| 0.346429999999983 | 0.042 |
| 0.347439999999983 | 0.042 |
| 0.348449999999983 | 0.042 |
| 0.349459999999983 | 0.043 |
| 0.350469999999983 | 0.043 |
| 0.351479999999983 | 0.043 |
| 0.352489999999983 | 0.044 |
| 0.353499999999983 | 0.044 |
| 0.354509999999983 | 0.045 |
| 0.355519999999983 | 0.045 |
| 0.356529999999983 | 0.045 |
| 0.357539999999983 | 0.046 |
| 0.358549999999983 | 0.046 |
| 0.359559999999984 | 0.046 |
| 0.360569999999984 | 0.047 |
| 0.361579999999984 | 0.047 |
| 0.362589999999984 | 0.048 |
| 0.363599999999984 | 0.048 |
| 0.364609999999984 | 0.048 |
| 0.365619999999984 | 0.049 |
| 0.366629999999984 | 0.049 |
| 0.367639999999984 | 0.05 |
| 0.368649999999984 | 0.05 |
| 0.369659999999984 | 0.051 |
| 0.370669999999984 | 0.051 |
| 0.371679999999984 | 0.051 |
| 0.372689999999984 | 0.052 |
| 0.373699999999984 | 0.052 |
| 0.374709999999984 | 0.053 |
| 0.375719999999984 | 0.053 |
| 0.376729999999984 | 0.053 |
| 0.377739999999984 | 0.054 |
| 0.378749999999984 | 0.054 |
| 0.379759999999984 | 0.055 |
| 0.380769999999984 | 0.055 |
| 0.381779999999984 | 0.056 |
| 0.382789999999984 | 0.056 |
| 0.383799999999984 | 0.057 |
| 0.384809999999984 | 0.057 |
| 0.385819999999984 | 0.057 |
| 0.386829999999984 | 0.058 |
| 0.387839999999984 | 0.058 |
| 0.388849999999984 | 0.059 |
| 0.389859999999984 | 0.059 |
| 0.390869999999984 | 0.06 |
| 0.391879999999984 | 0.06 |
| 0.392889999999984 | 0.061 |
| 0.393899999999984 | 0.061 |
| 0.394909999999984 | 0.062 |
| 0.395919999999984 | 0.062 |
| 0.396929999999984 | 0.063 |
| 0.397939999999984 | 0.063 |
| 0.398949999999984 | 0.063 |
| 0.399959999999984 | 0.064 |
| 0.400969999999984 | 0.064 |
| 0.401979999999984 | 0.065 |
| 0.402989999999984 | 0.065 |
| 0.403999999999984 | 0.066 |
| 0.405009999999984 | 0.066 |
| 0.406019999999984 | 0.067 |
| 0.407029999999984 | 0.067 |
| 0.408039999999984 | 0.068 |
| 0.409049999999984 | 0.068 |
| 0.410059999999984 | 0.069 |
| 0.411069999999984 | 0.069 |
| 0.412079999999984 | 0.07 |
| 0.413089999999984 | 0.07 |
| 0.414099999999984 | 0.071 |
| 0.415109999999984 | 0.072 |
| 0.416119999999984 | 0.072 |
| 0.417129999999984 | 0.073 |
| 0.418139999999984 | 0.073 |
| 0.419149999999984 | 0.074 |
| 0.420159999999984 | 0.074 |
| 0.421169999999984 | 0.075 |
| 0.422179999999984 | 0.075 |
| 0.423189999999984 | 0.076 |
| 0.424199999999984 | 0.076 |
| 0.425209999999984 | 0.077 |
| 0.426219999999984 | 0.077 |
| 0.427229999999984 | 0.078 |
| 0.428239999999984 | 0.079 |
| 0.429249999999984 | 0.079 |
| 0.430259999999984 | 0.08 |
| 0.431269999999984 | 0.08 |
| 0.432279999999984 | 0.081 |
| 0.433289999999984 | 0.081 |
| 0.434299999999984 | 0.082 |
| 0.435309999999984 | 0.082 |
| 0.436319999999984 | 0.083 |
| 0.437329999999984 | 0.084 |
| 0.438339999999984 | 0.084 |
| 0.439349999999984 | 0.085 |
| 0.440359999999984 | 0.085 |
| 0.441369999999984 | 0.086 |
| 0.442379999999984 | 0.087 |
| 0.443389999999984 | 0.087 |
| 0.444399999999984 | 0.088 |
| 0.445409999999984 | 0.088 |
| 0.446419999999984 | 0.089 |
| 0.447429999999984 | 0.09 |
| 0.448439999999984 | 0.09 |
| 0.449449999999984 | 0.091 |
| 0.450459999999985 | 0.091 |
| 0.451469999999985 | 0.092 |
| 0.452479999999985 | 0.093 |
| 0.453489999999985 | 0.093 |
| 0.454499999999985 | 0.094 |
| 0.455509999999985 | 0.095 |
| 0.456519999999985 | 0.095 |
| 0.457529999999985 | 0.096 |
| 0.458539999999985 | 0.096 |
| 0.459549999999985 | 0.097 |
| 0.460559999999985 | 0.098 |
| 0.461569999999985 | 0.098 |
| 0.462579999999985 | 0.099 |
| 0.463589999999985 | 0.1 |
| 0.464599999999985 | 0.1 |
| 0.465609999999985 | 0.101 |
| 0.466619999999985 | 0.102 |
| 0.467629999999985 | 0.102 |
| 0.468639999999985 | 0.103 |
| 0.469649999999985 | 0.104 |
| 0.470659999999985 | 0.104 |
| 0.471669999999985 | 0.105 |
| 0.472679999999985 | 0.106 |
| 0.473689999999985 | 0.106 |
| 0.474699999999985 | 0.107 |
| 0.475709999999985 | 0.108 |
| 0.476719999999985 | 0.108 |
| 0.477729999999985 | 0.109 |
| 0.478739999999985 | 0.11 |
| 0.479749999999985 | 0.11 |
| 0.480759999999985 | 0.111 |
| 0.481769999999985 | 0.112 |
| 0.482779999999985 | 0.113 |
| 0.483789999999985 | 0.113 |
| 0.484799999999985 | 0.114 |
| 0.485809999999985 | 0.115 |
| 0.486819999999985 | 0.115 |
| 0.487829999999985 | 0.116 |
| 0.488839999999985 | 0.117 |
| 0.489849999999985 | 0.118 |
| 0.490859999999985 | 0.118 |
| 0.491869999999985 | 0.119 |
| 0.492879999999985 | 0.12 |
| 0.493889999999985 | 0.12 |
| 0.494899999999985 | 0.121 |
| 0.495909999999985 | 0.122 |
| 0.496919999999985 | 0.123 |
| 0.497929999999985 | 0.123 |
| 0.498939999999985 | 0.124 |
| 0.499949999999985 | 0.125 |
| 0.500959999999985 | 0.126 |
| 0.501969999999985 | 0.126 |
| 0.502979999999985 | 0.127 |
| 0.503989999999985 | 0.128 |
| 0.504999999999985 | 0.129 |
| 0.506009999999985 | 0.13 |
| 0.507019999999985 | 0.13 |
| 0.508029999999985 | 0.131 |
| 0.509039999999985 | 0.132 |
| 0.510049999999985 | 0.133 |
| 0.511059999999985 | 0.133 |
| 0.512069999999985 | 0.134 |
| 0.513079999999985 | 0.135 |
| 0.514089999999985 | 0.136 |
| 0.515099999999984 | 0.137 |
| 0.516109999999984 | 0.137 |
| 0.517119999999984 | 0.138 |
| 0.518129999999984 | 0.139 |
| 0.519139999999984 | 0.14 |
| 0.520149999999984 | 0.141 |
| 0.521159999999984 | 0.142 |
| 0.522169999999984 | 0.142 |
| 0.523179999999984 | 0.143 |
| 0.524189999999984 | 0.144 |
| 0.525199999999984 | 0.145 |
| 0.526209999999984 | 0.146 |
| 0.527219999999984 | 0.147 |
| 0.528229999999984 | 0.147 |
| 0.529239999999984 | 0.148 |
| 0.530249999999984 | 0.149 |
| 0.531259999999984 | 0.15 |
| 0.532269999999984 | 0.151 |
| 0.533279999999984 | 0.152 |
| 0.534289999999984 | 0.153 |
| 0.535299999999984 | 0.153 |
| 0.536309999999984 | 0.154 |
| 0.537319999999983 | 0.155 |
| 0.538329999999983 | 0.156 |
| 0.539339999999983 | 0.157 |
| 0.540349999999983 | 0.158 |
| 0.541359999999983 | 0.159 |
| 0.542369999999983 | 0.16 |
| 0.543379999999983 | 0.16 |
| 0.544389999999983 | 0.161 |
| 0.545399999999983 | 0.162 |
| 0.546409999999983 | 0.163 |
| 0.547419999999983 | 0.164 |
| 0.548429999999983 | 0.165 |
| 0.549439999999983 | 0.166 |
| 0.550449999999983 | 0.167 |
| 0.551459999999983 | 0.168 |
| 0.552469999999983 | 0.169 |
| 0.553479999999983 | 0.17 |
| 0.554489999999983 | 0.17 |
| 0.555499999999983 | 0.171 |
| 0.556509999999983 | 0.172 |
| 0.557519999999983 | 0.173 |
| 0.558529999999983 | 0.174 |
| 0.559539999999982 | 0.175 |
| 0.560549999999982 | 0.176 |
| 0.561559999999982 | 0.177 |
| 0.562569999999982 | 0.178 |
| 0.563579999999982 | 0.179 |
| 0.564589999999982 | 0.18 |
| 0.565599999999982 | 0.181 |
| 0.566609999999982 | 0.182 |
| 0.567619999999982 | 0.183 |
| 0.568629999999982 | 0.184 |
| 0.569639999999982 | 0.185 |
| 0.570649999999982 | 0.186 |
| 0.571659999999982 | 0.187 |
| 0.572669999999982 | 0.188 |
| 0.573679999999982 | 0.189 |
| 0.574689999999982 | 0.19 |
| 0.575699999999982 | 0.191 |
| 0.576709999999982 | 0.192 |
| 0.577719999999982 | 0.193 |
| 0.578729999999982 | 0.194 |
| 0.579739999999982 | 0.195 |
| 0.580749999999982 | 0.196 |
| 0.581759999999981 | 0.197 |
| 0.582769999999981 | 0.198 |
| 0.583779999999981 | 0.199 |
| 0.584789999999981 | 0.2 |
| 0.585799999999981 | 0.201 |
| 0.586809999999981 | 0.202 |
| 0.587819999999981 | 0.203 |
| 0.588829999999981 | 0.204 |
| 0.589839999999981 | 0.205 |
| 0.590849999999981 | 0.206 |
| 0.591859999999981 | 0.207 |
| 0.592869999999981 | 0.208 |
| 0.593879999999981 | 0.209 |
| 0.594889999999981 | 0.211 |
| 0.595899999999981 | 0.212 |
| 0.596909999999981 | 0.213 |
| 0.597919999999981 | 0.214 |
| 0.598929999999981 | 0.215 |
| 0.599939999999981 | 0.216 |
| 0.600949999999981 | 0.217 |
| 0.601959999999981 | 0.218 |
| 0.60296999999998 | 0.219 |
| 0.60397999999998 | 0.22 |
| 0.60498999999998 | 0.221 |
| 0.60599999999998 | 0.223 |
| 0.60700999999998 | 0.224 |
| 0.60801999999998 | 0.225 |
| 0.60902999999998 | 0.226 |
| 0.61003999999998 | 0.227 |
| 0.61104999999998 | 0.228 |
| 0.61205999999998 | 0.229 |
| 0.61306999999998 | 0.23 |
| 0.61407999999998 | 0.232 |
| 0.61508999999998 | 0.233 |
| 0.61609999999998 | 0.234 |
| 0.61710999999998 | 0.235 |
| 0.61811999999998 | 0.236 |
| 0.61912999999998 | 0.237 |
| 0.62013999999998 | 0.238 |
| 0.62114999999998 | 0.24 |
| 0.62215999999998 | 0.241 |
| 0.62316999999998 | 0.242 |
| 0.62417999999998 | 0.243 |
| 0.62518999999998 | 0.244 |
| 0.626199999999979 | 0.246 |
| 0.627209999999979 | 0.247 |
| 0.628219999999979 | 0.248 |
| 0.629229999999979 | 0.249 |
| 0.630239999999979 | 0.25 |
| 0.631249999999979 | 0.252 |
| 0.632259999999979 | 0.253 |
| 0.633269999999979 | 0.254 |
| 0.634279999999979 | 0.255 |
| 0.635289999999979 | 0.256 |
| 0.636299999999979 | 0.258 |
| 0.637309999999979 | 0.259 |
| 0.638319999999979 | 0.26 |
| 0.639329999999979 | 0.261 |
| 0.640339999999979 | 0.263 |
| 0.641349999999979 | 0.264 |
| 0.642359999999979 | 0.265 |
| 0.643369999999979 | 0.266 |
| 0.644379999999979 | 0.268 |
| 0.645389999999979 | 0.269 |
| 0.646399999999979 | 0.27 |
| 0.647409999999979 | 0.271 |
| 0.648419999999978 | 0.273 |
| 0.649429999999978 | 0.274 |
| 0.650439999999978 | 0.275 |
| 0.651449999999978 | 0.276 |
| 0.652459999999978 | 0.278 |
| 0.653469999999978 | 0.279 |
| 0.654479999999978 | 0.28 |
| 0.655489999999978 | 0.282 |
| 0.656499999999978 | 0.283 |
| 0.657509999999978 | 0.284 |
| 0.658519999999978 | 0.286 |
| 0.659529999999978 | 0.287 |
| 0.660539999999978 | 0.288 |
| 0.661549999999978 | 0.29 |
| 0.662559999999978 | 0.291 |
| 0.663569999999978 | 0.292 |
| 0.664579999999978 | 0.294 |
| 0.665589999999978 | 0.295 |
| 0.666599999999978 | 0.296 |
| 0.667609999999978 | 0.298 |
| 0.668619999999978 | 0.299 |
| 0.669629999999978 | 0.3 |
| 0.670639999999977 | 0.302 |
| 0.671649999999977 | 0.303 |
| 0.672659999999977 | 0.304 |
| 0.673669999999977 | 0.306 |
| 0.674679999999977 | 0.307 |
| 0.675689999999977 | 0.308 |
| 0.676699999999977 | 0.31 |
| 0.677709999999977 | 0.311 |
| 0.678719999999977 | 0.313 |
| 0.679729999999977 | 0.314 |
| 0.680739999999977 | 0.315 |
| 0.681749999999977 | 0.317 |
| 0.682759999999977 | 0.318 |
| 0.683769999999977 | 0.32 |
| 0.684779999999977 | 0.321 |
| 0.685789999999977 | 0.323 |
| 0.686799999999977 | 0.324 |
| 0.687809999999977 | 0.325 |
| 0.688819999999977 | 0.327 |
| 0.689829999999977 | 0.328 |
| 0.690839999999977 | 0.33 |
| 0.691849999999977 | 0.331 |
| 0.692859999999976 | 0.333 |
| 0.693869999999976 | 0.334 |
| 0.694879999999976 | 0.336 |
| 0.695889999999976 | 0.337 |
| 0.696899999999976 | 0.338 |
| 0.697909999999976 | 0.34 |
| 0.698919999999976 | 0.341 |
| 0.699929999999976 | 0.343 |
| 0.700939999999976 | 0.344 |
| 0.701949999999976 | 0.346 |
| 0.702959999999976 | 0.347 |
| 0.703969999999976 | 0.349 |
| 0.704979999999976 | 0.35 |
| 0.705989999999976 | 0.352 |
| 0.706999999999976 | 0.353 |
| 0.708009999999976 | 0.355 |
| 0.709019999999976 | 0.356 |
| 0.710029999999976 | 0.358 |
| 0.711039999999976 | 0.359 |
| 0.712049999999976 | 0.361 |
| 0.713059999999976 | 0.363 |
| 0.714069999999976 | 0.364 |
| 0.715079999999976 | 0.366 |
| 0.716089999999976 | 0.367 |
| 0.717099999999975 | 0.369 |
| 0.718109999999975 | 0.37 |
| 0.719119999999975 | 0.372 |
| 0.720129999999975 | 0.373 |
| 0.721139999999975 | 0.375 |
| 0.722149999999975 | 0.377 |
| 0.723159999999975 | 0.378 |
| 0.724169999999975 | 0.38 |
| 0.725179999999975 | 0.381 |
| 0.726189999999975 | 0.383 |
| 0.727199999999975 | 0.385 |
| 0.728209999999975 | 0.386 |
| 0.729219999999975 | 0.388 |
| 0.730229999999975 | 0.389 |
| 0.731239999999975 | 0.391 |
| 0.732249999999975 | 0.393 |
| 0.733259999999975 | 0.394 |
| 0.734269999999975 | 0.396 |
| 0.735279999999975 | 0.398 |
| 0.736289999999975 | 0.399 |
| 0.737299999999975 | 0.401 |
| 0.738309999999975 | 0.402 |
| 0.739319999999974 | 0.404 |
| 0.740329999999974 | 0.406 |
| 0.741339999999974 | 0.407 |
| 0.742349999999974 | 0.409 |
| 0.743359999999974 | 0.411 |
| 0.744369999999974 | 0.412 |
| 0.745379999999974 | 0.414 |
| 0.746389999999974 | 0.416 |
| 0.747399999999974 | 0.418 |
| 0.748409999999974 | 0.419 |
| 0.749419999999974 | 0.421 |
| 0.750429999999974 | 0.423 |
| 0.751439999999974 | 0.424 |
| 0.752449999999974 | 0.426 |
| 0.753459999999974 | 0.428 |
| 0.754469999999974 | 0.429 |
| 0.755479999999974 | 0.431 |
| 0.756489999999974 | 0.433 |
| 0.757499999999974 | 0.435 |
| 0.758509999999974 | 0.436 |
| 0.759519999999974 | 0.438 |
| 0.760529999999974 | 0.44 |
| 0.761539999999973 | 0.442 |
| 0.762549999999973 | 0.443 |
| 0.763559999999973 | 0.445 |
| 0.764569999999973 | 0.447 |
| 0.765579999999973 | 0.449 |
| 0.766589999999973 | 0.45 |
| 0.767599999999973 | 0.452 |
| 0.768609999999973 | 0.454 |
| 0.769619999999973 | 0.456 |
| 0.770629999999973 | 0.458 |
| 0.771639999999973 | 0.459 |
| 0.772649999999973 | 0.461 |
| 0.773659999999973 | 0.463 |
| 0.774669999999973 | 0.465 |
| 0.775679999999973 | 0.467 |
| 0.776689999999973 | 0.469 |
| 0.777699999999973 | 0.47 |
| 0.778709999999973 | 0.472 |
| 0.779719999999973 | 0.474 |
| 0.780729999999973 | 0.476 |
| 0.781739999999973 | 0.478 |
| 0.782749999999973 | 0.48 |
| 0.783759999999973 | 0.481 |
| 0.784769999999972 | 0.483 |
| 0.785779999999972 | 0.485 |
| 0.786789999999972 | 0.487 |
| 0.787799999999972 | 0.489 |
| 0.788809999999972 | 0.491 |
| 0.789819999999972 | 0.493 |
| 0.790829999999972 | 0.495 |
| 0.791839999999972 | 0.496 |
| 0.792849999999972 | 0.498 |
| 0.793859999999972 | 0.5 |
| 0.794869999999972 | 0.502 |
| 0.795879999999972 | 0.504 |
| 0.796889999999972 | 0.506 |
| 0.797899999999972 | 0.508 |
| 0.798909999999972 | 0.51 |
| 0.799919999999972 | 0.512 |
| 0.800929999999972 | 0.514 |
| 0.801939999999972 | 0.516 |
| 0.802949999999972 | 0.518 |
| 0.803959999999972 | 0.52 |
| 0.804969999999972 | 0.522 |
| 0.805979999999972 | 0.524 |
| 0.806989999999972 | 0.526 |
| 0.807999999999971 | 0.528 |
| 0.809009999999971 | 0.529 |
| 0.810019999999971 | 0.531 |
| 0.811029999999971 | 0.533 |
| 0.812039999999971 | 0.535 |
| 0.813049999999971 | 0.537 |
| 0.814059999999971 | 0.539 |
| 0.815069999999971 | 0.541 |
| 0.816079999999971 | 0.543 |
| 0.817089999999971 | 0.546 |
| 0.818099999999971 | 0.548 |
| 0.819109999999971 | 0.55 |
| 0.820119999999971 | 0.552 |
| 0.821129999999971 | 0.554 |
| 0.822139999999971 | 0.556 |
| 0.823149999999971 | 0.558 |
| 0.824159999999971 | 0.56 |
| 0.825169999999971 | 0.562 |
| 0.826179999999971 | 0.564 |
| 0.827189999999971 | 0.566 |
| 0.828199999999971 | 0.568 |
| 0.829209999999971 | 0.57 |
| 0.83021999999997 | 0.572 |
| 0.83122999999997 | 0.574 |
| 0.83223999999997 | 0.576 |
| 0.83324999999997 | 0.579 |
| 0.83425999999997 | 0.581 |
| 0.83526999999997 | 0.583 |
| 0.83627999999997 | 0.585 |
| 0.83728999999997 | 0.587 |
| 0.83829999999997 | 0.589 |
| 0.83930999999997 | 0.591 |
| 0.84031999999997 | 0.593 |
| 0.84132999999997 | 0.596 |
| 0.84233999999997 | 0.598 |
| 0.84334999999997 | 0.6 |
| 0.84435999999997 | 0.602 |
| 0.84536999999997 | 0.604 |
| 0.84637999999997 | 0.606 |
| 0.84738999999997 | 0.608 |
| 0.84839999999997 | 0.611 |
| 0.84940999999997 | 0.613 |
| 0.85041999999997 | 0.615 |
| 0.85142999999997 | 0.617 |
| 0.85243999999997 | 0.619 |
| 0.853449999999969 | 0.622 |
| 0.854459999999969 | 0.624 |
| 0.855469999999969 | 0.626 |
| 0.856479999999969 | 0.628 |
| 0.857489999999969 | 0.631 |
| 0.858499999999969 | 0.633 |
| 0.859509999999969 | 0.635 |
| 0.860519999999969 | 0.637 |
| 0.861529999999969 | 0.639 |
| 0.862539999999969 | 0.642 |
| 0.863549999999969 | 0.644 |
| 0.864559999999969 | 0.646 |
| 0.865569999999969 | 0.648 |
| 0.866579999999969 | 0.651 |
| 0.867589999999969 | 0.653 |
| 0.868599999999969 | 0.655 |
| 0.869609999999969 | 0.658 |
| 0.870619999999969 | 0.66 |
| 0.871629999999969 | 0.662 |
| 0.872639999999969 | 0.665 |
| 0.873649999999969 | 0.667 |
| 0.874659999999969 | 0.669 |
| 0.875669999999968 | 0.671 |
| 0.876679999999968 | 0.674 |
| 0.877689999999968 | 0.676 |
| 0.878699999999968 | 0.678 |
| 0.879709999999968 | 0.681 |
| 0.880719999999968 | 0.683 |
| 0.881729999999968 | 0.685 |
| 0.882739999999968 | 0.688 |
| 0.883749999999968 | 0.69 |
| 0.884759999999968 | 0.693 |
| 0.885769999999968 | 0.695 |
| 0.886779999999968 | 0.697 |
| 0.887789999999968 | 0.7 |
| 0.888799999999968 | 0.702 |
| 0.889809999999968 | 0.705 |
| 0.890819999999968 | 0.707 |
| 0.891829999999968 | 0.709 |
| 0.892839999999968 | 0.712 |
| 0.893849999999968 | 0.714 |
| 0.894859999999968 | 0.717 |
| 0.895869999999968 | 0.719 |
| 0.896879999999968 | 0.721 |
| 0.897889999999967 | 0.724 |
| 0.898899999999967 | 0.726 |
| 0.899909999999967 | 0.729 |
| 0.900919999999967 | 0.731 |
| 0.901929999999967 | 0.734 |
| 0.902939999999967 | 0.736 |
| 0.903949999999967 | 0.739 |
| 0.904959999999967 | 0.741 |
| 0.905969999999967 | 0.744 |
| 0.906979999999967 | 0.746 |
| 0.907989999999967 | 0.749 |
| 0.908999999999967 | 0.751 |
| 0.910009999999967 | 0.754 |
| 0.911019999999967 | 0.756 |
| 0.912029999999967 | 0.759 |
| 0.913039999999967 | 0.761 |
| 0.914049999999967 | 0.764 |
| 0.915059999999967 | 0.766 |
| 0.916069999999967 | 0.769 |
| 0.917079999999967 | 0.771 |
| 0.918089999999967 | 0.774 |
| 0.919099999999967 | 0.776 |
| 0.920109999999967 | 0.779 |
| 0.921119999999966 | 0.782 |
| 0.922129999999966 | 0.784 |
| 0.923139999999966 | 0.787 |
| 0.924149999999966 | 0.789 |
| 0.925159999999966 | 0.792 |
| 0.926169999999966 | 0.794 |
| 0.927179999999966 | 0.797 |
| 0.928189999999966 | 0.8 |
| 0.929199999999966 | 0.802 |
| 0.930209999999966 | 0.805 |
| 0.931219999999966 | 0.808 |
| 0.932229999999966 | 0.81 |
| 0.933239999999966 | 0.813 |
| 0.934249999999966 | 0.815 |
| 0.935259999999966 | 0.818 |
| 0.936269999999966 | 0.821 |
| 0.937279999999966 | 0.823 |
| 0.938289999999966 | 0.826 |
| 0.939299999999966 | 0.829 |
| 0.940309999999966 | 0.831 |
| 0.941319999999966 | 0.834 |
| 0.942329999999966 | 0.837 |
| 0.943339999999966 | 0.839 |
| 0.944349999999965 | 0.842 |
| 0.945359999999965 | 0.845 |
| 0.946369999999965 | 0.848 |
| 0.947379999999965 | 0.85 |
| 0.948389999999965 | 0.853 |
| 0.949399999999965 | 0.856 |
| 0.950409999999965 | 0.858 |
| 0.951419999999965 | 0.861 |
| 0.952429999999965 | 0.864 |
| 0.953439999999965 | 0.867 |
| 0.954449999999965 | 0.869 |
| 0.955459999999965 | 0.872 |
| 0.956469999999965 | 0.875 |
| 0.957479999999965 | 0.878 |
| 0.958489999999965 | 0.881 |
| 0.959499999999965 | 0.883 |
| 0.960509999999965 | 0.886 |
| 0.961519999999965 | 0.889 |
| 0.962529999999965 | 0.892 |
| 0.963539999999965 | 0.895 |
| 0.964549999999965 | 0.897 |
| 0.965559999999965 | 0.9 |
| 0.966569999999964 | 0.903 |
| 0.967579999999964 | 0.906 |
| 0.968589999999964 | 0.909 |
| 0.969599999999964 | 0.912 |
| 0.970609999999964 | 0.914 |
| 0.971619999999964 | 0.917 |
| 0.972629999999964 | 0.92 |
| 0.973639999999964 | 0.923 |
| 0.974649999999964 | 0.926 |
| 0.975659999999964 | 0.929 |
| 0.976669999999964 | 0.932 |
| 0.977679999999964 | 0.935 |
| 0.978689999999964 | 0.937 |
| 0.979699999999964 | 0.94 |
| 0.980709999999964 | 0.943 |
| 0.981719999999964 | 0.946 |
| 0.982729999999964 | 0.949 |
| 0.983739999999964 | 0.952 |
| 0.984749999999964 | 0.955 |
| 0.985759999999964 | 0.958 |
| 0.986769999999964 | 0.961 |
| 0.987779999999964 | 0.964 |
| 0.988789999999963 | 0.967 |
| 0.989799999999963 | 0.97 |
| 0.990809999999963 | 0.973 |
| 0.991819999999963 | 0.976 |
| 0.992829999999963 | 0.979 |
| 0.993839999999963 | 0.982 |
| 0.994849999999963 | 0.985 |
| 0.995859999999963 | 0.988 |
| 0.996869999999963 | 0.991 |
| 0.997879999999963 | 0.994 |
| 0.998889999999963 | 0.997 |
| 0.999899999999963 | 1 |
| 1.000909999999963 | 1.003 |
| 1.001919999999963 | 1.006 |
| 1.002929999999963 | 1.009 |
| 1.003939999999963 | 1.012 |
| 1.004949999999963 | 1.015 |
| 1.005959999999963 | 1.018 |
| 1.006969999999963 | 1.021 |
| 1.007979999999963 | 1.024 |
| 1.008989999999963 | 1.027 |
| 1.009999999999963 | 1.03 |